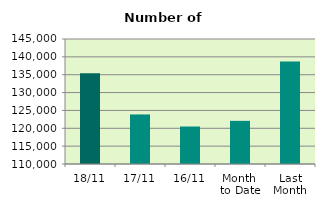
| Category | Series 0 |
|---|---|
| 18/11 | 135408 |
| 17/11 | 123876 |
| 16/11 | 120494 |
| Month 
to Date | 122079.286 |
| Last
Month | 138693.238 |